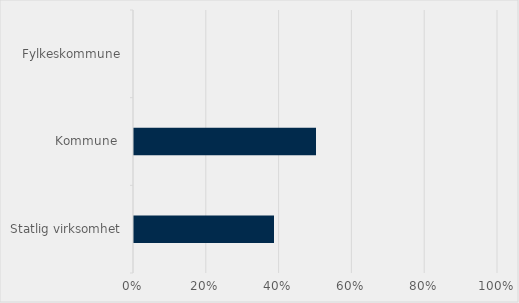
| Category | Series 0 |
|---|---|
| Statlig virksomhet | 0.385 |
| Kommune  | 0.5 |
| Fylkeskommune | 0 |